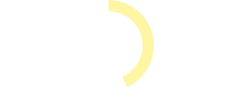
| Category | Series 0 |
|---|---|
| Zielerreichung | 0.433 |
| Delta Kreis | 0.567 |